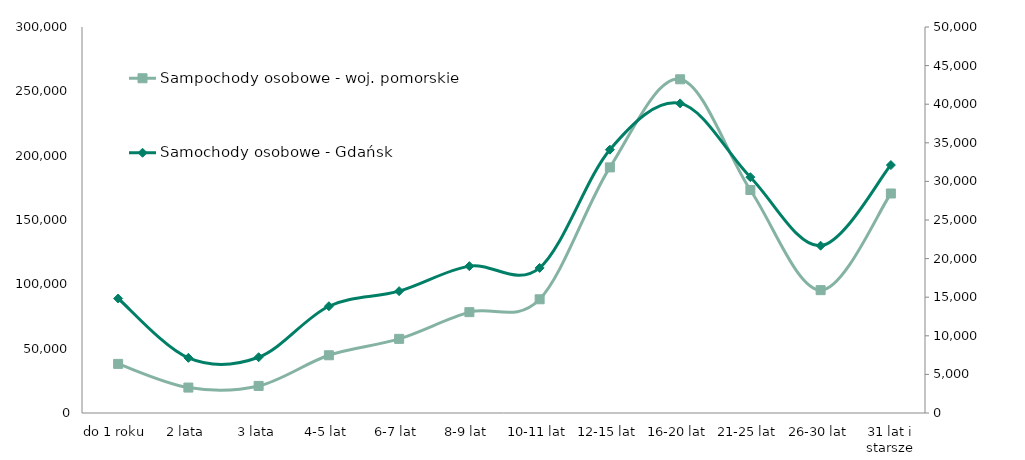
| Category | Sampochody osobowe - woj. pomorskie |
|---|---|
| do 1 roku | 38180 |
| 2 lata | 19760 |
| 3 lata | 21048 |
| 4-5 lat | 44863 |
| 6-7 lat | 57625 |
| 8-9 lat | 78383 |
| 10-11 lat | 88385 |
| 12-15 lat | 190886 |
| 16-20 lat | 259358 |
| 21-25 lat | 173318 |
| 26-30 lat | 95485 |
| 31 lat i starsze | 170600 |